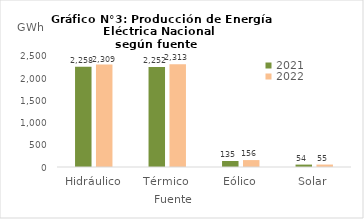
| Category | 2021 | 2022 |
|---|---|---|
| Hidráulico | 2258.332 | 2309.401 |
| Térmico | 2251.979 | 2313.388 |
| Eólico | 134.653 | 155.893 |
| Solar | 54.278 | 55.024 |